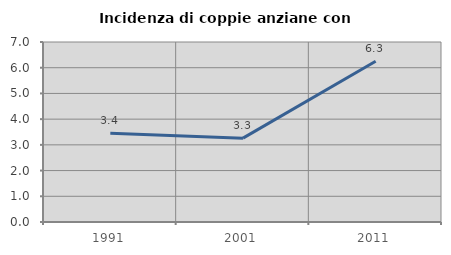
| Category | Incidenza di coppie anziane con figli |
|---|---|
| 1991.0 | 3.448 |
| 2001.0 | 3.261 |
| 2011.0 | 6.25 |